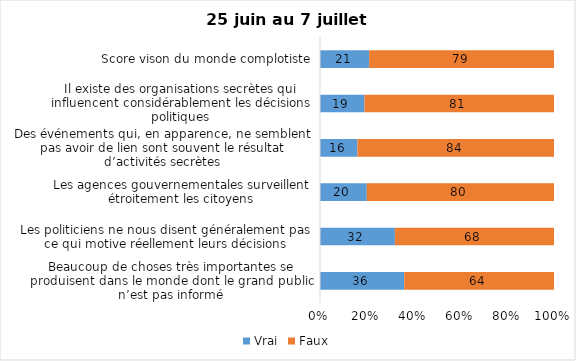
| Category | Vrai | Faux |
|---|---|---|
| Beaucoup de choses très importantes se produisent dans le monde dont le grand public n’est pas informé | 36 | 64 |
| Les politiciens ne nous disent généralement pas ce qui motive réellement leurs décisions | 32 | 68 |
| Les agences gouvernementales surveillent étroitement les citoyens | 20 | 80 |
| Des événements qui, en apparence, ne semblent pas avoir de lien sont souvent le résultat d’activités secrètes | 16 | 84 |
| Il existe des organisations secrètes qui influencent considérablement les décisions politiques | 19 | 81 |
| Score vison du monde complotiste | 21 | 79 |